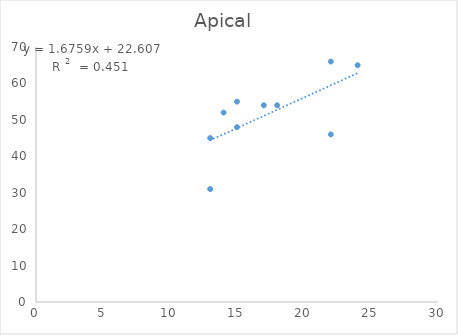
| Category | Apical  |
|---|---|
| 14.0 | 52 |
| 17.0 | 54 |
| 18.0 | 54 |
| 13.0 | 31 |
| 13.0 | 45 |
| 24.0 | 65 |
| 15.0 | 55 |
| 15.0 | 48 |
| 22.0 | 66 |
| 22.0 | 46 |